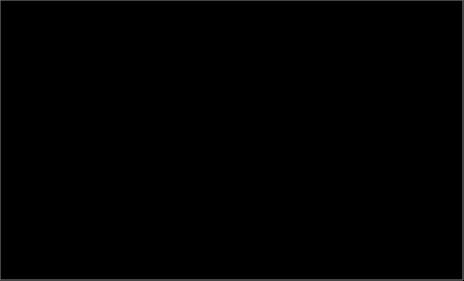
| Category | Series 0 |
|---|---|
| Gaver | 0 |
| Annen inntekt | 0 |
| Barnetrygd m.m. | 0 |
| Renter m.m | 0 |
| Udekkede utgifter | 0 |